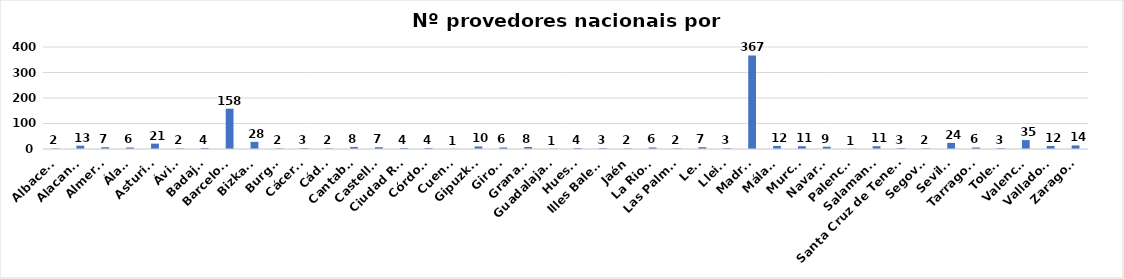
| Category | Series 0 |
|---|---|
| Albacete | 2 |
| Alacante | 13 |
| Almería | 7 |
| Álava | 6 |
| Asturias | 21 |
| Ávila | 2 |
| Badajoz | 4 |
| Barcelona | 158 |
| Bizkaia | 28 |
| Burgos | 2 |
| Cáceres | 3 |
| Cádiz | 2 |
| Cantabria | 8 |
| Castellón | 7 |
| Ciudad Real | 4 |
| Córdoba | 4 |
| Cuenca | 1 |
| Gipuzkoa | 10 |
| Girona | 6 |
| Granada | 8 |
| Guadalajara | 1 |
| Huesca | 4 |
| Illes Balears | 3 |
| Jaén | 2 |
| La Rioja | 6 |
| Las Palmas | 2 |
| León | 7 |
| Lleida | 3 |
| Madrid | 367 |
| Málaga | 12 |
| Murcia | 11 |
| Navarra | 9 |
| Palencia | 1 |
| Salamanca | 11 |
| Santa Cruz de Tenerife | 3 |
| Segovia | 2 |
| Sevilla | 24 |
| Tarragona | 6 |
| Toledo | 3 |
| Valencia | 35 |
| Valladolid | 12 |
| Zaragoza | 14 |